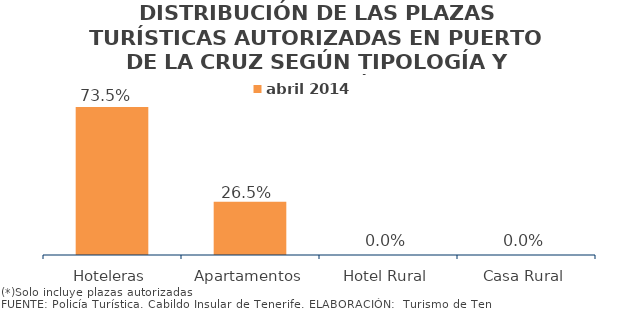
| Category | abril 2014 |
|---|---|
| Hoteleras | 0.735 |
| Apartamentos | 0.265 |
| Hotel Rural | 0 |
| Casa Rural | 0 |